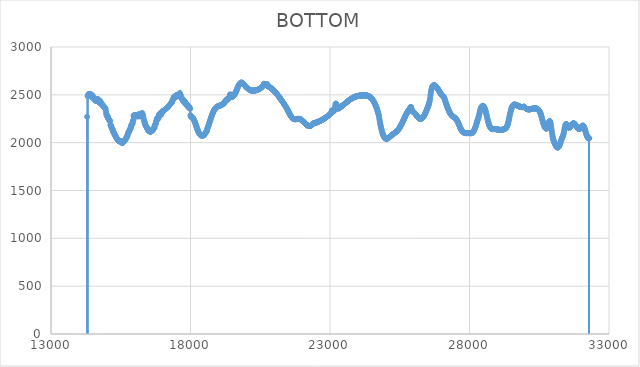
| Category | BOTTOM |
|---|---|
| 14294.5 | 2270.8 |
| 14301.6338 | -9999 |
| 14311.8733 | 2486.17 |
| 14322.1134 | 2484.76 |
| 14332.3535 | 2498.84 |
| 14342.5936 | 2503.06 |
| 14352.8337 | 2508.69 |
| 14363.0738 | 2507.28 |
| 14373.3139 | 2501.65 |
| 14383.554 | 2508.69 |
| 14393.7941 | 2505.87 |
| 14404.0342 | 2507.28 |
| 14414.2743 | 2501.65 |
| 14424.5144 | 2500.24 |
| 14434.7545 | 2493.2 |
| 14444.9946 | 2503.06 |
| 14455.2347 | 2500.24 |
| 14465.4748 | 2496.02 |
| 14475.7149 | 2469.28 |
| 14485.955 | 2481.94 |
| 14496.1951 | 2491.8 |
| 14506.4352 | 2472.09 |
| 14516.6753 | 2477.72 |
| 14526.9154 | 2459.42 |
| 14537.1555 | 2466.46 |
| 14547.3956 | 2463.64 |
| 14557.6357 | 2458.01 |
| 14567.8758 | 2456.61 |
| 14578.1159 | 2441.12 |
| 14588.356 | 2450.98 |
| 14598.5961 | 2438.31 |
| 14608.8362 | 2439.72 |
| 14619.0763 | 2438.31 |
| 14629.3164 | 2442.53 |
| 14639.5565 | 2442.53 |
| 14649.7966 | 2455.2 |
| 14660.0367 | 2435.49 |
| 14670.2768 | 2446.75 |
| 14680.5169 | 2456.61 |
| 14690.757 | 2441.12 |
| 14700.9971 | 2425.64 |
| 14711.2372 | 2425.64 |
| 14721.4772 | 2431.27 |
| 14731.7173 | 2421.42 |
| 14741.9574 | 2412.97 |
| 14752.1975 | 2438.31 |
| 14762.4376 | 2431.27 |
| 14772.6777 | 2428.45 |
| 14782.9178 | 2417.19 |
| 14793.1579 | 2417.19 |
| 14803.398 | 2412.97 |
| 14813.6381 | 2397.49 |
| 14823.8782 | 2397.49 |
| 14834.1183 | 2394.67 |
| 14844.3584 | 2393.26 |
| 14854.5985 | 2391.86 |
| 14864.8386 | 2393.26 |
| 14875.0787 | 2382 |
| 14885.3188 | 2382 |
| 14895.5589 | 2369.33 |
| 14905.799 | 2370.74 |
| 14916.0391 | 2365.11 |
| 14926.2792 | 2363.7 |
| 14936.5193 | 2362.3 |
| 14946.7594 | 2360.89 |
| 14956.9995 | 2351.04 |
| 14967.2396 | 2329.92 |
| 14977.4797 | 2308.81 |
| 14987.7198 | 2291.92 |
| 14997.9599 | 2290.51 |
| 15008.2 | 2273.62 |
| 15018.4401 | 2283.47 |
| 15028.6802 | 2275.02 |
| 15038.9203 | 2267.99 |
| 15049.1604 | 2256.73 |
| 15059.4005 | 2248.28 |
| 15069.6406 | 2242.65 |
| 15079.8807 | 2242.65 |
| 15090.1208 | 2237.02 |
| 15100.3609 | 2228.57 |
| 15110.601 | 2227.17 |
| 15120.8411 | 2225.76 |
| 15131.0812 | 2186.34 |
| 15141.3213 | 2182.12 |
| 15151.5614 | 2182.12 |
| 15161.8015 | 2166.64 |
| 15172.0416 | 2158.19 |
| 15182.2817 | 2151.15 |
| 15192.5218 | 2144.12 |
| 15202.7619 | 2138.49 |
| 15213.0019 | 2137.08 |
| 15223.242 | 2117.37 |
| 15233.4821 | 2115.96 |
| 15243.7222 | 2107.52 |
| 15253.9623 | 2101.89 |
| 15264.2024 | 2096.26 |
| 15274.4425 | 2085 |
| 15284.6826 | 2085 |
| 15294.9227 | 2080.77 |
| 15305.1628 | 2073.74 |
| 15315.4029 | 2065.29 |
| 15325.643 | 2062.47 |
| 15335.8831 | 2055.44 |
| 15346.1232 | 2049.81 |
| 15356.3633 | 2042.77 |
| 15366.6034 | 2038.54 |
| 15376.8435 | 2042.77 |
| 15387.0836 | 2031.51 |
| 15397.3237 | 2028.69 |
| 15407.5638 | 2023.06 |
| 15417.8039 | 2023.06 |
| 15428.044 | 2023.06 |
| 15438.2841 | 2017.43 |
| 15448.5242 | 2013.21 |
| 15458.7643 | 2013.21 |
| 15469.0044 | 2013.21 |
| 15479.2445 | 2014.62 |
| 15489.4846 | 2014.62 |
| 15499.7247 | 2014.62 |
| 15509.9648 | 2016.02 |
| 15520.2049 | 2007.58 |
| 15530.445 | 2007.58 |
| 15540.6851 | 1996.32 |
| 15550.9252 | 1997.72 |
| 15561.1653 | 1997.72 |
| 15571.4054 | 1999.13 |
| 15581.6455 | 2001.95 |
| 15591.8856 | 2003.35 |
| 15602.1257 | 2007.58 |
| 15612.3658 | 2013.21 |
| 15622.6059 | 2013.21 |
| 15632.846 | 2021.65 |
| 15643.0861 | 2020.25 |
| 15653.3262 | 2025.88 |
| 15663.5663 | 2035.73 |
| 15673.8064 | 2035.73 |
| 15684.0465 | 2039.95 |
| 15694.2866 | 2044.18 |
| 15704.5266 | 2056.84 |
| 15714.7667 | 2058.25 |
| 15725.0068 | 2061.07 |
| 15735.2469 | 2076.55 |
| 15745.487 | 2076.55 |
| 15755.7271 | 2093.44 |
| 15765.9672 | 2101.89 |
| 15776.2073 | 2103.3 |
| 15786.4474 | 2110.33 |
| 15796.6875 | 2117.37 |
| 15806.9276 | 2123 |
| 15817.1677 | 2132.86 |
| 15827.4078 | 2132.86 |
| 15837.6479 | 2139.89 |
| 15847.888 | 2149.75 |
| 15858.1281 | 2158.19 |
| 15868.3682 | 2163.82 |
| 15878.6083 | 2183.53 |
| 15888.8484 | 2187.75 |
| 15899.0885 | 2189.16 |
| 15909.3286 | 2190.57 |
| 15919.5687 | 2200.42 |
| 15929.8088 | 2210.27 |
| 15940.0489 | 2231.39 |
| 15950.289 | 2231.39 |
| 15960.5291 | 2284.88 |
| 15970.7692 | 2266.58 |
| 15981.0093 | 2277.84 |
| 15991.2494 | 2290.51 |
| 16001.4895 | 2286.29 |
| 16011.7296 | 2283.47 |
| 16021.9697 | 2283.47 |
| 16032.2098 | 2282.06 |
| 16042.4499 | 2279.25 |
| 16052.69 | 2279.25 |
| 16062.9301 | 2275.02 |
| 16073.1702 | 2275.02 |
| 16083.4103 | 2282.06 |
| 16093.6504 | 2283.47 |
| 16103.8905 | 2276.43 |
| 16114.1306 | 2286.29 |
| 16124.3707 | 2279.25 |
| 16134.6108 | 2297.55 |
| 16144.8509 | 2276.43 |
| 16155.091 | 2276.43 |
| 16165.3311 | 2277.84 |
| 16175.5712 | 2277.84 |
| 16185.8113 | 2276.43 |
| 16196.0514 | 2282.06 |
| 16206.2914 | 2301.77 |
| 16216.5315 | 2301.77 |
| 16226.7716 | 2300.36 |
| 16237.0117 | 2297.55 |
| 16247.2518 | 2283.47 |
| 16257.4919 | 2282.06 |
| 16267.732 | 2311.62 |
| 16277.9721 | 2298.95 |
| 16288.2122 | 2291.92 |
| 16298.4523 | 2282.06 |
| 16308.6924 | 2266.58 |
| 16318.9325 | 2251.09 |
| 16329.1726 | 2229.98 |
| 16339.4127 | 2228.57 |
| 16349.6528 | 2214.5 |
| 16359.8929 | 2211.68 |
| 16370.133 | 2196.2 |
| 16380.3731 | 2184.94 |
| 16390.6132 | 2182.12 |
| 16400.8533 | 2175.08 |
| 16411.0934 | 2168.05 |
| 16421.3335 | 2165.23 |
| 16431.5736 | 2162.42 |
| 16441.8137 | 2151.15 |
| 16452.0538 | 2149.75 |
| 16462.2939 | 2139.89 |
| 16472.534 | 2132.86 |
| 16482.7741 | 2130.04 |
| 16493.0142 | 2125.82 |
| 16503.2543 | 2124.41 |
| 16513.4944 | 2124.41 |
| 16523.7345 | 2118.78 |
| 16533.9746 | 2118.78 |
| 16544.2147 | 2117.37 |
| 16554.4548 | 2114.56 |
| 16564.6949 | 2114.56 |
| 16574.935 | 2114.56 |
| 16585.1751 | 2118.78 |
| 16595.4152 | 2120.19 |
| 16605.6553 | 2132.86 |
| 16615.8954 | 2121.59 |
| 16626.1355 | 2125.82 |
| 16636.3756 | 2128.63 |
| 16646.6157 | 2132.86 |
| 16656.8558 | 2132.86 |
| 16667.0959 | 2142.71 |
| 16677.336 | 2144.12 |
| 16687.5761 | 2152.56 |
| 16697.8162 | 2155.38 |
| 16708.0563 | 2159.6 |
| 16718.2963 | 2180.71 |
| 16728.5364 | 2182.12 |
| 16738.7765 | 2189.16 |
| 16749.0166 | 2199.01 |
| 16759.2567 | 2199.01 |
| 16769.4968 | 2220.13 |
| 16779.7369 | 2227.17 |
| 16789.977 | 2248.28 |
| 16800.2171 | 2255.32 |
| 16810.4572 | 2256.73 |
| 16820.6973 | 2251.09 |
| 16830.9374 | 2259.54 |
| 16841.1775 | 2248.28 |
| 16851.4176 | 2260.95 |
| 16861.6577 | 2282.06 |
| 16871.8978 | 2296.14 |
| 16882.1379 | 2296.14 |
| 16892.378 | 2291.92 |
| 16902.6181 | 2303.18 |
| 16912.8582 | 2296.14 |
| 16923.0983 | 2305.99 |
| 16933.3384 | 2298.95 |
| 16943.5785 | 2289.1 |
| 16953.8186 | 2304.58 |
| 16964.0587 | 2308.81 |
| 16974.2988 | 2321.48 |
| 16984.5389 | 2323.43 |
| 16994.779 | 2325.44 |
| 17005.0191 | 2327.5 |
| 17015.2592 | 2329.63 |
| 17025.4993 | 2331.8 |
| 17035.7394 | 2334.04 |
| 17045.9795 | 2336.33 |
| 17056.2196 | 2338.67 |
| 17066.4597 | 2341.07 |
| 17076.6998 | 2343.53 |
| 17086.9399 | 2346.04 |
| 17097.18 | 2348.61 |
| 17107.4201 | 2351.24 |
| 17117.6602 | 2353.92 |
| 17127.9003 | 2356.65 |
| 17138.1404 | 2359.45 |
| 17148.3805 | 2362.29 |
| 17158.6206 | 2365.2 |
| 17168.8607 | 2368.16 |
| 17179.1008 | 2371.18 |
| 17189.3409 | 2374.25 |
| 17199.581 | 2377.38 |
| 17209.8211 | 2380.56 |
| 17220.0612 | 2383.8 |
| 17230.3013 | 2387.1 |
| 17240.5413 | 2390.45 |
| 17250.7814 | 2393.86 |
| 17261.0215 | 2397.32 |
| 17271.2616 | 2400.84 |
| 17281.5017 | 2404.42 |
| 17291.7418 | 2408.05 |
| 17301.9819 | 2411.74 |
| 17312.222 | 2415.48 |
| 17322.4621 | 2419.28 |
| 17332.7022 | 2423.14 |
| 17342.9423 | 2427.05 |
| 17353.1824 | 2439.72 |
| 17363.4225 | 2452.38 |
| 17373.6626 | 2448.16 |
| 17383.9027 | 2455.2 |
| 17394.1428 | 2466.46 |
| 17404.3829 | 2479.13 |
| 17414.623 | 2469.28 |
| 17424.8631 | 2469.28 |
| 17435.1032 | 2483.35 |
| 17445.3433 | 2484.76 |
| 17455.5834 | 2486.17 |
| 17465.8235 | 2481.94 |
| 17476.0636 | 2491.8 |
| 17486.3037 | 2477.72 |
| 17496.5438 | 2483.35 |
| 17506.7839 | 2498.84 |
| 17517.024 | 2498.84 |
| 17527.2641 | 2497.43 |
| 17537.5042 | 2494.61 |
| 17547.7443 | 2496.02 |
| 17557.9844 | 2496.02 |
| 17568.2245 | 2496.02 |
| 17578.4646 | 2496.02 |
| 17588.7047 | 2498.84 |
| 17598.9448 | 2498.84 |
| 17609.1849 | 2501.65 |
| 17619.425 | 2519.95 |
| 17629.6651 | 2498.84 |
| 17639.9052 | 2497.43 |
| 17650.1453 | 2497.43 |
| 17660.3854 | 2469.28 |
| 17670.6255 | 2469.28 |
| 17680.8656 | 2459.42 |
| 17691.1057 | 2463.64 |
| 17701.3458 | 2450.98 |
| 17711.5859 | 2459.42 |
| 17721.826 | 2453.79 |
| 17732.0661 | 2436.9 |
| 17742.3062 | 2432.68 |
| 17752.5463 | 2432.68 |
| 17762.7864 | 2427.05 |
| 17773.0264 | 2427.05 |
| 17783.2665 | 2424.23 |
| 17793.5066 | 2414.38 |
| 17803.7467 | 2429.86 |
| 17813.9868 | 2420.01 |
| 17824.2269 | 2404.53 |
| 17834.467 | 2401.71 |
| 17844.7071 | 2401.71 |
| 17854.9472 | 2403.12 |
| 17865.1873 | 2403.12 |
| 17875.4274 | 2390.45 |
| 17885.6675 | 2398.89 |
| 17895.9076 | 2380.6 |
| 17906.1477 | 2387.63 |
| 17916.3878 | 2383.41 |
| 17926.6279 | 2367.93 |
| 17936.868 | 2376.37 |
| 17947.1081 | 2374.97 |
| 17957.3482 | 2370.74 |
| 17967.5883 | 2362.3 |
| 17977.8284 | 2362.3 |
| 17988.0685 | 2352.44 |
| 17998.3086 | 2287.69 |
| 18008.5487 | 2277.84 |
| 18018.7888 | 2273.62 |
| 18029.0289 | 2265.17 |
| 18039.269 | 2265.17 |
| 18049.5091 | 2265.17 |
| 18059.7492 | 2264.41 |
| 18069.9893 | 2262.6 |
| 18080.2294 | 2259.83 |
| 18090.4695 | 2256.17 |
| 18100.7096 | 2251.68 |
| 18110.9497 | 2246.45 |
| 18121.1898 | 2240.53 |
| 18131.4299 | 2234 |
| 18141.67 | 2226.94 |
| 18151.9101 | 2219.41 |
| 18162.1502 | 2211.48 |
| 18172.3903 | 2203.24 |
| 18182.6304 | 2194.74 |
| 18192.8705 | 2186.06 |
| 18203.1106 | 2177.28 |
| 18213.3507 | 2168.46 |
| 18223.5908 | 2159.67 |
| 18233.8309 | 2150.99 |
| 18244.071 | 2142.49 |
| 18254.3111 | 2134.24 |
| 18264.5512 | 2126.31 |
| 18274.7913 | 2118.78 |
| 18285.0314 | 2111.71 |
| 18295.2715 | 2105.17 |
| 18305.5116 | 2099.24 |
| 18315.7517 | 2094 |
| 18325.9917 | 2089.5 |
| 18336.2318 | 2085.82 |
| 18346.4719 | 2083.04 |
| 18356.712 | 2081.22 |
| 18366.9521 | 2080.44 |
| 18377.1922 | 2080.77 |
| 18387.4323 | 2079.37 |
| 18397.6724 | 2069.51 |
| 18407.9125 | 2077.96 |
| 18418.1526 | 2076.55 |
| 18428.3927 | 2075.14 |
| 18438.6328 | 2075.14 |
| 18448.8729 | 2076.55 |
| 18459.113 | 2076.55 |
| 18469.3531 | 2076.55 |
| 18479.5932 | 2077.96 |
| 18489.8333 | 2082.18 |
| 18500.0734 | 2086.4 |
| 18510.3135 | 2092.03 |
| 18520.5536 | 2092.03 |
| 18530.7937 | 2099.07 |
| 18541.0338 | 2104.7 |
| 18551.2739 | 2107.52 |
| 18561.514 | 2113.15 |
| 18571.7541 | 2118.78 |
| 18581.9942 | 2118.78 |
| 18592.2343 | 2138.49 |
| 18602.4744 | 2145.77 |
| 18612.7145 | 2153.38 |
| 18622.9546 | 2161.3 |
| 18633.1947 | 2169.48 |
| 18643.4348 | 2177.9 |
| 18653.6749 | 2186.52 |
| 18663.915 | 2195.31 |
| 18674.1551 | 2204.23 |
| 18684.3952 | 2213.25 |
| 18694.6353 | 2222.34 |
| 18704.8754 | 2231.47 |
| 18715.1155 | 2240.59 |
| 18725.3556 | 2249.69 |
| 18735.5957 | 2258.71 |
| 18745.8358 | 2267.63 |
| 18756.0759 | 2276.38 |
| 18766.316 | 2284.92 |
| 18776.5561 | 2293.21 |
| 18786.7962 | 2301.2 |
| 18797.0363 | 2308.84 |
| 18807.2764 | 2316.08 |
| 18817.5165 | 2322.88 |
| 18827.7566 | 2329.2 |
| 18837.9967 | 2335.05 |
| 18848.2368 | 2340.45 |
| 18858.4769 | 2345.43 |
| 18868.717 | 2350 |
| 18878.957 | 2354.19 |
| 18889.1971 | 2358.02 |
| 18899.4372 | 2361.51 |
| 18909.6773 | 2364.68 |
| 18919.9174 | 2367.55 |
| 18930.1575 | 2370.15 |
| 18940.3976 | 2372.5 |
| 18950.6377 | 2374.62 |
| 18960.8778 | 2376.53 |
| 18971.1179 | 2378.25 |
| 18981.358 | 2379.81 |
| 18991.5981 | 2381.22 |
| 19001.8382 | 2382.52 |
| 19012.0783 | 2383.71 |
| 19022.3184 | 2384.82 |
| 19032.5585 | 2385.87 |
| 19042.7986 | 2386.89 |
| 19053.0387 | 2387.9 |
| 19063.2788 | 2388.91 |
| 19073.5189 | 2389.96 |
| 19083.759 | 2391.06 |
| 19093.9991 | 2392.22 |
| 19104.2392 | 2393.49 |
| 19114.4793 | 2394.87 |
| 19124.7194 | 2396.39 |
| 19134.9595 | 2398.07 |
| 19145.1996 | 2399.93 |
| 19155.4397 | 2402 |
| 19165.6798 | 2404.29 |
| 19175.9199 | 2406.83 |
| 19186.16 | 2409.63 |
| 19196.4001 | 2412.73 |
| 19206.6402 | 2416.14 |
| 19216.8803 | 2419.88 |
| 19227.1204 | 2423.98 |
| 19237.3605 | 2428.45 |
| 19247.6006 | 2438.31 |
| 19257.8407 | 2434.08 |
| 19268.0808 | 2443.94 |
| 19278.3209 | 2441.12 |
| 19288.561 | 2441.12 |
| 19298.8011 | 2448.16 |
| 19309.0412 | 2456.61 |
| 19319.2813 | 2449.57 |
| 19329.5214 | 2452.38 |
| 19339.7615 | 2458.01 |
| 19350.0016 | 2459.42 |
| 19360.2417 | 2462.24 |
| 19370.4818 | 2467.87 |
| 19380.7219 | 2467.87 |
| 19390.962 | 2467.87 |
| 19401.2021 | 2483.35 |
| 19411.4422 | 2504.47 |
| 19421.6823 | 2490.39 |
| 19431.9224 | 2490.39 |
| 19442.1625 | 2493.2 |
| 19452.4025 | 2494.61 |
| 19462.6426 | 2493.2 |
| 19472.8827 | 2503.06 |
| 19483.1228 | 2483.35 |
| 19493.3629 | 2481.91 |
| 19503.603 | 2481.46 |
| 19513.8431 | 2481.94 |
| 19524.0832 | 2483.3 |
| 19534.3233 | 2485.46 |
| 19544.5634 | 2488.37 |
| 19554.8035 | 2491.97 |
| 19565.0436 | 2496.19 |
| 19575.2837 | 2500.98 |
| 19585.5238 | 2506.27 |
| 19595.7639 | 2512.01 |
| 19606.004 | 2518.13 |
| 19616.2441 | 2524.57 |
| 19626.4842 | 2531.27 |
| 19636.7243 | 2538.17 |
| 19646.9644 | 2545.21 |
| 19657.2045 | 2552.32 |
| 19667.4446 | 2559.46 |
| 19677.6847 | 2566.54 |
| 19687.9248 | 2573.53 |
| 19698.1649 | 2580.34 |
| 19708.405 | 2586.93 |
| 19718.6451 | 2593.23 |
| 19728.8852 | 2599.18 |
| 19739.1253 | 2604.72 |
| 19749.3654 | 2609.78 |
| 19759.6055 | 2614.32 |
| 19769.8456 | 2618.26 |
| 19780.0857 | 2621.54 |
| 19790.3258 | 2624.11 |
| 19800.5659 | 2625.93 |
| 19810.806 | 2627.01 |
| 19821.0461 | 2627.43 |
| 19831.2862 | 2627.23 |
| 19841.5263 | 2626.47 |
| 19851.7664 | 2625.19 |
| 19862.0065 | 2623.46 |
| 19872.2466 | 2621.32 |
| 19882.4867 | 2618.83 |
| 19892.7268 | 2616.03 |
| 19902.9669 | 2613 |
| 19913.207 | 2609.76 |
| 19923.4471 | 2606.39 |
| 19933.6872 | 2602.93 |
| 19943.9273 | 2599.44 |
| 19954.1674 | 2595.96 |
| 19964.4075 | 2592.55 |
| 19974.6476 | 2589.21 |
| 19984.8877 | 2585.96 |
| 19995.1278 | 2582.79 |
| 20005.3679 | 2579.7 |
| 20015.608 | 2576.72 |
| 20025.8481 | 2573.83 |
| 20036.0882 | 2571.04 |
| 20046.3282 | 2568.36 |
| 20056.5683 | 2565.79 |
| 20066.8084 | 2563.34 |
| 20077.0485 | 2561.01 |
| 20087.2886 | 2558.8 |
| 20097.5287 | 2556.72 |
| 20107.7688 | 2554.78 |
| 20118.0089 | 2552.97 |
| 20128.249 | 2551.31 |
| 20138.4891 | 2549.79 |
| 20148.7292 | 2548.43 |
| 20158.9693 | 2547.22 |
| 20169.2094 | 2546.17 |
| 20179.4495 | 2545.29 |
| 20189.6896 | 2544.57 |
| 20199.9297 | 2544.01 |
| 20210.1698 | 2543.61 |
| 20220.4099 | 2543.34 |
| 20230.65 | 2543.22 |
| 20240.8901 | 2543.21 |
| 20251.1302 | 2543.32 |
| 20261.3703 | 2543.54 |
| 20271.6104 | 2543.86 |
| 20281.8505 | 2544.27 |
| 20292.0906 | 2544.76 |
| 20302.3307 | 2545.32 |
| 20312.5708 | 2545.94 |
| 20322.8109 | 2546.62 |
| 20333.051 | 2547.34 |
| 20343.2911 | 2548.1 |
| 20353.5312 | 2548.89 |
| 20363.7713 | 2549.72 |
| 20374.0114 | 2550.58 |
| 20384.2515 | 2551.5 |
| 20394.4916 | 2552.47 |
| 20404.7317 | 2553.51 |
| 20414.9718 | 2554.62 |
| 20425.2119 | 2555.81 |
| 20435.452 | 2557.08 |
| 20445.6921 | 2558.45 |
| 20455.9322 | 2559.92 |
| 20466.1723 | 2561.49 |
| 20476.4124 | 2563.18 |
| 20486.6525 | 2564.99 |
| 20496.8926 | 2566.94 |
| 20507.1327 | 2569.01 |
| 20517.3728 | 2571.24 |
| 20527.6129 | 2573.61 |
| 20537.853 | 2576.15 |
| 20548.0931 | 2578.84 |
| 20558.3332 | 2581.72 |
| 20568.5733 | 2584.77 |
| 20578.8134 | 2588.01 |
| 20589.0535 | 2591.45 |
| 20599.2936 | 2595.09 |
| 20609.5337 | 2598.93 |
| 20619.7738 | 2603 |
| 20630.0139 | 2615.67 |
| 20640.2539 | 2615.67 |
| 20650.494 | 2612.85 |
| 20660.7341 | 2612.85 |
| 20670.9742 | 2610.04 |
| 20681.2143 | 2608.63 |
| 20691.4544 | 2608.63 |
| 20701.6945 | 2608.63 |
| 20711.9346 | 2608.63 |
| 20722.1747 | 2608.63 |
| 20732.4148 | 2610.04 |
| 20742.6549 | 2610.04 |
| 20752.895 | 2611.44 |
| 20763.1351 | 2590.33 |
| 20773.3752 | 2591.74 |
| 20783.6153 | 2590.33 |
| 20793.8554 | 2587.52 |
| 20804.0955 | 2585.94 |
| 20814.3356 | 2584.28 |
| 20824.5757 | 2582.53 |
| 20834.8158 | 2580.68 |
| 20845.0559 | 2578.76 |
| 20855.296 | 2576.74 |
| 20865.5361 | 2574.64 |
| 20875.7762 | 2572.46 |
| 20886.0163 | 2570.2 |
| 20896.2564 | 2567.85 |
| 20906.4965 | 2565.43 |
| 20916.7366 | 2562.93 |
| 20926.9767 | 2560.36 |
| 20937.2168 | 2557.71 |
| 20947.4569 | 2554.99 |
| 20957.697 | 2552.19 |
| 20967.9371 | 2549.33 |
| 20978.1772 | 2546.39 |
| 20988.4173 | 2543.39 |
| 20998.6574 | 2540.33 |
| 21008.8975 | 2537.2 |
| 21019.1376 | 2534 |
| 21029.3777 | 2530.75 |
| 21039.6178 | 2527.43 |
| 21049.8579 | 2524.06 |
| 21060.098 | 2520.62 |
| 21070.3381 | 2517.13 |
| 21080.5782 | 2513.59 |
| 21090.8183 | 2509.99 |
| 21101.0584 | 2506.35 |
| 21111.2985 | 2502.65 |
| 21121.5386 | 2498.9 |
| 21131.7787 | 2495.1 |
| 21142.0188 | 2491.26 |
| 21152.2589 | 2487.37 |
| 21162.499 | 2483.44 |
| 21172.7391 | 2479.47 |
| 21182.9792 | 2475.46 |
| 21193.2193 | 2471.4 |
| 21203.4594 | 2467.31 |
| 21213.6995 | 2463.18 |
| 21223.9396 | 2459.02 |
| 21234.1797 | 2454.83 |
| 21244.4198 | 2450.6 |
| 21254.6599 | 2446.34 |
| 21264.8999 | 2442.05 |
| 21275.14 | 2437.74 |
| 21285.3801 | 2433.39 |
| 21295.6202 | 2429.03 |
| 21305.8603 | 2424.63 |
| 21316.1004 | 2420.22 |
| 21326.3405 | 2415.79 |
| 21336.5806 | 2411.33 |
| 21346.8207 | 2406.85 |
| 21357.0608 | 2402.33 |
| 21367.3009 | 2397.77 |
| 21377.541 | 2393.16 |
| 21387.7811 | 2388.49 |
| 21398.0212 | 2383.76 |
| 21408.2613 | 2378.95 |
| 21418.5014 | 2374.06 |
| 21428.7415 | 2369.09 |
| 21438.9816 | 2364.02 |
| 21449.2217 | 2358.84 |
| 21459.4618 | 2353.56 |
| 21469.7019 | 2348.15 |
| 21479.942 | 2342.62 |
| 21490.1821 | 2336.96 |
| 21500.4222 | 2331.16 |
| 21510.6623 | 2325.27 |
| 21520.9024 | 2319.31 |
| 21531.1425 | 2313.35 |
| 21541.3826 | 2307.41 |
| 21551.6227 | 2301.55 |
| 21561.8628 | 2295.8 |
| 21572.1029 | 2290.21 |
| 21582.343 | 2284.82 |
| 21592.5831 | 2279.67 |
| 21602.8232 | 2274.8 |
| 21613.0633 | 2270.27 |
| 21623.3034 | 2266.11 |
| 21633.5435 | 2262.36 |
| 21643.7836 | 2259.05 |
| 21654.0237 | 2256.18 |
| 21664.2638 | 2253.71 |
| 21674.5039 | 2251.62 |
| 21684.744 | 2249.88 |
| 21694.9841 | 2248.46 |
| 21705.2242 | 2247.35 |
| 21715.4643 | 2246.51 |
| 21725.7044 | 2245.91 |
| 21735.9445 | 2245.54 |
| 21746.1846 | 2245.37 |
| 21756.4247 | 2245.36 |
| 21766.6648 | 2245.49 |
| 21776.9049 | 2245.74 |
| 21787.145 | 2246.09 |
| 21797.3851 | 2246.49 |
| 21807.6252 | 2246.94 |
| 21817.8653 | 2247.39 |
| 21828.1054 | 2247.84 |
| 21838.3455 | 2248.24 |
| 21848.5856 | 2248.57 |
| 21858.8257 | 2248.82 |
| 21869.0658 | 2248.94 |
| 21879.3059 | 2248.92 |
| 21889.546 | 2248.73 |
| 21899.786 | 2248.34 |
| 21910.0261 | 2247.73 |
| 21920.2662 | 2246.87 |
| 21930.5063 | 2245.74 |
| 21940.7464 | 2244.36 |
| 21950.9865 | 2242.73 |
| 21961.2266 | 2240.89 |
| 21971.4667 | 2238.84 |
| 21981.7068 | 2236.6 |
| 21991.9469 | 2234.2 |
| 22002.187 | 2231.65 |
| 22012.4271 | 2228.97 |
| 22022.6672 | 2226.18 |
| 22032.9073 | 2223.3 |
| 22043.1474 | 2220.34 |
| 22053.3875 | 2217.32 |
| 22063.6276 | 2214.26 |
| 22073.8677 | 2211.18 |
| 22084.1078 | 2208.1 |
| 22094.3479 | 2205.03 |
| 22104.588 | 2202 |
| 22114.8281 | 2199.01 |
| 22125.0682 | 2196.1 |
| 22135.3083 | 2193.27 |
| 22145.5484 | 2190.56 |
| 22155.7885 | 2187.96 |
| 22166.0286 | 2185.51 |
| 22176.2687 | 2183.21 |
| 22186.5088 | 2181.1 |
| 22196.7489 | 2179.18 |
| 22206.989 | 2177.48 |
| 22217.2291 | 2176.01 |
| 22227.4692 | 2174.79 |
| 22237.7093 | 2173.84 |
| 22247.9494 | 2173.18 |
| 22258.1895 | 2172.83 |
| 22268.4296 | 2172.79 |
| 22278.6697 | 2173.1 |
| 22288.9098 | 2173.77 |
| 22299.1499 | 2174.82 |
| 22309.39 | 2176.27 |
| 22319.6301 | 2178.13 |
| 22329.8702 | 2180.42 |
| 22340.1103 | 2183.16 |
| 22350.3504 | 2186.38 |
| 22360.5905 | 2190.08 |
| 22370.8306 | 2194.28 |
| 22381.0707 | 2199.01 |
| 22391.3108 | 2199.75 |
| 22401.5509 | 2200.51 |
| 22411.791 | 2201.31 |
| 22422.0311 | 2202.13 |
| 22432.2712 | 2202.98 |
| 22442.5113 | 2203.86 |
| 22452.7514 | 2204.78 |
| 22462.9915 | 2205.72 |
| 22473.2316 | 2206.69 |
| 22483.4717 | 2207.69 |
| 22493.7118 | 2208.73 |
| 22503.9519 | 2209.79 |
| 22514.192 | 2210.88 |
| 22524.4321 | 2212 |
| 22534.6722 | 2213.15 |
| 22544.9122 | 2214.33 |
| 22555.1523 | 2215.54 |
| 22565.3924 | 2216.78 |
| 22575.6325 | 2218.05 |
| 22585.8726 | 2219.35 |
| 22596.1127 | 2220.68 |
| 22606.3528 | 2222.04 |
| 22616.5929 | 2223.43 |
| 22626.833 | 2224.85 |
| 22637.0731 | 2226.3 |
| 22647.3132 | 2227.77 |
| 22657.5533 | 2229.28 |
| 22667.7934 | 2230.82 |
| 22678.0335 | 2232.39 |
| 22688.2736 | 2233.98 |
| 22698.5137 | 2235.61 |
| 22708.7538 | 2237.27 |
| 22718.9939 | 2238.95 |
| 22729.234 | 2240.67 |
| 22739.4741 | 2242.42 |
| 22749.7142 | 2244.19 |
| 22759.9543 | 2246 |
| 22770.1944 | 2247.83 |
| 22780.4345 | 2249.7 |
| 22790.6746 | 2251.59 |
| 22800.9147 | 2253.52 |
| 22811.1548 | 2255.47 |
| 22821.3949 | 2257.45 |
| 22831.635 | 2259.47 |
| 22841.8751 | 2261.51 |
| 22852.1152 | 2263.59 |
| 22862.3553 | 2265.69 |
| 22872.5954 | 2267.82 |
| 22882.8355 | 2269.98 |
| 22893.0756 | 2272.18 |
| 22903.3157 | 2274.4 |
| 22913.5558 | 2276.65 |
| 22923.7959 | 2278.93 |
| 22934.036 | 2281.24 |
| 22944.2761 | 2283.58 |
| 22954.5162 | 2285.95 |
| 22964.7563 | 2288.35 |
| 22974.9964 | 2290.79 |
| 22985.2365 | 2293.25 |
| 22995.4766 | 2295.74 |
| 23005.7167 | 2298.25 |
| 23015.9568 | 2300.8 |
| 23026.1969 | 2303.38 |
| 23036.437 | 2305.99 |
| 23046.6771 | 2318.66 |
| 23056.9172 | 2320.07 |
| 23067.1573 | 2338.37 |
| 23077.3974 | 2335.55 |
| 23087.6375 | 2329.92 |
| 23097.8776 | 2329.92 |
| 23108.1177 | 2322.88 |
| 23118.3578 | 2331.33 |
| 23128.5979 | 2331.33 |
| 23138.838 | 2331.33 |
| 23149.0781 | 2335.55 |
| 23159.3182 | 2336.96 |
| 23169.5583 | 2348.22 |
| 23179.7984 | 2369.33 |
| 23190.0385 | 2389.04 |
| 23200.2786 | 2407.34 |
| 23210.5187 | 2405.93 |
| 23220.7587 | 2407.34 |
| 23230.9988 | 2403.12 |
| 23241.2389 | 2382 |
| 23251.479 | 2360.89 |
| 23261.7191 | 2377.78 |
| 23271.9592 | 2363.7 |
| 23282.1993 | 2365.11 |
| 23292.4394 | 2355.26 |
| 23302.6795 | 2357.03 |
| 23312.9196 | 2358.86 |
| 23323.1597 | 2360.75 |
| 23333.3998 | 2362.69 |
| 23343.6399 | 2364.68 |
| 23353.88 | 2366.73 |
| 23364.1201 | 2368.82 |
| 23374.3602 | 2370.95 |
| 23384.6003 | 2373.13 |
| 23394.8404 | 2375.34 |
| 23405.0805 | 2377.6 |
| 23415.3206 | 2379.89 |
| 23425.5607 | 2382.2 |
| 23435.8008 | 2384.55 |
| 23446.0409 | 2386.93 |
| 23456.281 | 2389.33 |
| 23466.5211 | 2391.75 |
| 23476.7612 | 2394.18 |
| 23487.0013 | 2396.64 |
| 23497.2414 | 2399.11 |
| 23507.4815 | 2401.59 |
| 23517.7216 | 2404.07 |
| 23527.9617 | 2406.57 |
| 23538.2018 | 2409.07 |
| 23548.4419 | 2411.56 |
| 23558.682 | 2414.06 |
| 23568.9221 | 2416.55 |
| 23579.1622 | 2419.04 |
| 23589.4023 | 2421.51 |
| 23599.6424 | 2423.97 |
| 23609.8825 | 2426.42 |
| 23620.1226 | 2428.85 |
| 23630.3627 | 2431.26 |
| 23640.6028 | 2433.65 |
| 23650.8429 | 2436.02 |
| 23661.083 | 2438.35 |
| 23671.3231 | 2440.66 |
| 23681.5632 | 2442.93 |
| 23691.8033 | 2445.17 |
| 23702.0434 | 2447.37 |
| 23712.2835 | 2449.53 |
| 23722.5236 | 2451.65 |
| 23732.7637 | 2453.72 |
| 23743.0038 | 2455.75 |
| 23753.2439 | 2457.72 |
| 23763.484 | 2459.64 |
| 23773.7241 | 2461.5 |
| 23783.9642 | 2463.31 |
| 23794.2043 | 2465.05 |
| 23804.4444 | 2466.73 |
| 23814.6845 | 2468.35 |
| 23824.9246 | 2469.91 |
| 23835.1647 | 2471.41 |
| 23845.4048 | 2472.85 |
| 23855.6449 | 2474.23 |
| 23865.885 | 2475.55 |
| 23876.1251 | 2476.82 |
| 23886.3652 | 2478.03 |
| 23896.6053 | 2479.19 |
| 23906.8454 | 2480.3 |
| 23917.0855 | 2481.36 |
| 23927.3255 | 2482.36 |
| 23937.5656 | 2483.32 |
| 23947.8057 | 2484.23 |
| 23958.0458 | 2485.09 |
| 23968.2859 | 2485.91 |
| 23978.526 | 2486.68 |
| 23988.7661 | 2487.41 |
| 23999.0062 | 2488.09 |
| 24009.2463 | 2488.74 |
| 24019.4864 | 2489.34 |
| 24029.7265 | 2489.91 |
| 24039.9666 | 2490.43 |
| 24050.2067 | 2490.92 |
| 24060.4468 | 2491.38 |
| 24070.6869 | 2491.8 |
| 24080.927 | 2492.19 |
| 24091.1671 | 2492.54 |
| 24101.4072 | 2492.86 |
| 24111.6473 | 2493.15 |
| 24121.8874 | 2493.42 |
| 24132.1275 | 2493.65 |
| 24142.3676 | 2493.86 |
| 24152.6077 | 2494.05 |
| 24162.8478 | 2494.2 |
| 24173.0879 | 2494.34 |
| 24183.328 | 2494.45 |
| 24193.5681 | 2494.54 |
| 24203.8082 | 2494.61 |
| 24214.0483 | 2494.66 |
| 24224.2884 | 2494.69 |
| 24234.5285 | 2494.68 |
| 24244.7686 | 2494.63 |
| 24255.0087 | 2494.53 |
| 24265.2488 | 2494.37 |
| 24275.4889 | 2494.15 |
| 24285.729 | 2493.87 |
| 24295.9691 | 2493.5 |
| 24306.2092 | 2493.05 |
| 24316.4493 | 2492.5 |
| 24326.6894 | 2491.86 |
| 24336.9295 | 2491.11 |
| 24347.1696 | 2490.25 |
| 24357.4097 | 2489.26 |
| 24367.6498 | 2488.14 |
| 24377.8899 | 2486.89 |
| 24388.13 | 2485.5 |
| 24398.3701 | 2483.95 |
| 24408.6102 | 2482.24 |
| 24418.8503 | 2480.37 |
| 24429.0904 | 2478.33 |
| 24439.3305 | 2476.1 |
| 24449.5706 | 2473.69 |
| 24459.8107 | 2471.08 |
| 24470.0508 | 2468.27 |
| 24480.2909 | 2465.25 |
| 24490.531 | 2462.02 |
| 24500.7711 | 2458.56 |
| 24511.0112 | 2454.86 |
| 24521.2513 | 2450.93 |
| 24531.4914 | 2446.75 |
| 24541.7315 | 2442.32 |
| 24551.9716 | 2437.63 |
| 24562.2117 | 2432.67 |
| 24572.4518 | 2427.43 |
| 24582.6919 | 2421.91 |
| 24592.932 | 2416.1 |
| 24603.1721 | 2409.99 |
| 24613.4122 | 2403.58 |
| 24623.6523 | 2396.85 |
| 24633.8924 | 2389.8 |
| 24644.1325 | 2382.43 |
| 24654.3725 | 2374.72 |
| 24664.6126 | 2366.68 |
| 24674.8527 | 2358.28 |
| 24685.0928 | 2349.52 |
| 24695.3329 | 2340.4 |
| 24705.573 | 2330.92 |
| 24715.8131 | 2321.05 |
| 24726.0532 | 2310.79 |
| 24736.2933 | 2300.15 |
| 24746.5334 | 2289.1 |
| 24756.7735 | 2269.93 |
| 24767.0136 | 2251.61 |
| 24777.2537 | 2234.11 |
| 24787.4938 | 2217.43 |
| 24797.7339 | 2201.57 |
| 24807.974 | 2186.51 |
| 24818.2141 | 2172.25 |
| 24828.4542 | 2158.78 |
| 24838.6943 | 2146.08 |
| 24848.9344 | 2134.16 |
| 24859.1745 | 2123 |
| 24869.4146 | 2112.6 |
| 24879.6547 | 2102.94 |
| 24889.8948 | 2094.02 |
| 24900.1349 | 2085.83 |
| 24910.375 | 2078.36 |
| 24920.6151 | 2071.61 |
| 24930.8552 | 2065.56 |
| 24941.0953 | 2060.2 |
| 24951.3354 | 2055.54 |
| 24961.5755 | 2051.55 |
| 24971.8156 | 2048.24 |
| 24982.0557 | 2045.58 |
| 24992.2958 | 2043.58 |
| 25002.5359 | 2042.19 |
| 25012.776 | 2041.36 |
| 25023.0161 | 2041.05 |
| 25033.2562 | 2041.23 |
| 25043.4963 | 2041.84 |
| 25053.7364 | 2042.84 |
| 25063.9765 | 2044.19 |
| 25074.2166 | 2045.84 |
| 25084.4567 | 2047.75 |
| 25094.6968 | 2049.88 |
| 25104.9369 | 2052.17 |
| 25115.177 | 2054.6 |
| 25125.4171 | 2057.11 |
| 25135.6572 | 2059.66 |
| 25145.8973 | 2062.21 |
| 25156.1374 | 2064.76 |
| 25166.3775 | 2067.29 |
| 25176.6176 | 2069.81 |
| 25186.8577 | 2072.31 |
| 25197.0978 | 2074.79 |
| 25207.3379 | 2077.25 |
| 25217.578 | 2079.67 |
| 25227.8181 | 2082.07 |
| 25238.0582 | 2084.43 |
| 25248.2983 | 2086.75 |
| 25258.5384 | 2089.03 |
| 25268.7785 | 2091.26 |
| 25279.0186 | 2093.44 |
| 25289.2587 | 2095.58 |
| 25299.4988 | 2097.68 |
| 25309.7389 | 2099.76 |
| 25319.979 | 2101.85 |
| 25330.2191 | 2103.97 |
| 25340.4592 | 2106.13 |
| 25350.6993 | 2108.35 |
| 25360.9394 | 2110.65 |
| 25371.1795 | 2113.05 |
| 25381.4196 | 2115.57 |
| 25391.6597 | 2118.23 |
| 25401.8997 | 2121.04 |
| 25412.1398 | 2124.03 |
| 25422.3799 | 2127.22 |
| 25432.62 | 2130.63 |
| 25442.8601 | 2134.26 |
| 25453.1002 | 2138.15 |
| 25463.3403 | 2142.28 |
| 25473.5804 | 2146.63 |
| 25483.8205 | 2151.21 |
| 25494.0606 | 2156 |
| 25504.3007 | 2160.98 |
| 25514.5408 | 2166.15 |
| 25524.7809 | 2171.49 |
| 25535.021 | 2176.99 |
| 25545.2611 | 2182.65 |
| 25555.5012 | 2188.45 |
| 25565.7413 | 2194.38 |
| 25575.9814 | 2200.42 |
| 25586.2215 | 2206.57 |
| 25596.4616 | 2212.81 |
| 25606.7017 | 2219.13 |
| 25616.9418 | 2225.51 |
| 25627.1819 | 2231.93 |
| 25637.422 | 2238.38 |
| 25647.6621 | 2244.84 |
| 25657.9022 | 2251.3 |
| 25668.1423 | 2257.74 |
| 25678.3824 | 2264.14 |
| 25688.6225 | 2270.5 |
| 25698.8626 | 2276.79 |
| 25709.1027 | 2282.99 |
| 25719.3428 | 2289.1 |
| 25729.5829 | 2295.09 |
| 25739.823 | 2300.96 |
| 25750.0631 | 2306.68 |
| 25760.3032 | 2312.24 |
| 25770.5433 | 2317.62 |
| 25780.7834 | 2322.81 |
| 25791.0235 | 2327.8 |
| 25801.2636 | 2332.55 |
| 25811.5037 | 2337.07 |
| 25821.7438 | 2341.34 |
| 25831.9839 | 2345.33 |
| 25842.224 | 2349.04 |
| 25852.4641 | 2352.44 |
| 25862.7042 | 2359.48 |
| 25872.9443 | 2360.89 |
| 25883.1844 | 2370.74 |
| 25893.4245 | 2373.56 |
| 25903.6646 | 2373.56 |
| 25913.9047 | 2336.96 |
| 25924.1448 | 2346.81 |
| 25934.3849 | 2345.41 |
| 25944.625 | 2334.14 |
| 25954.8651 | 2325.7 |
| 25965.1052 | 2324.8 |
| 25975.3453 | 2323.43 |
| 25985.5854 | 2321.64 |
| 25995.8255 | 2319.46 |
| 26006.0656 | 2316.93 |
| 26016.3057 | 2314.09 |
| 26026.5458 | 2310.97 |
| 26036.7859 | 2307.62 |
| 26047.026 | 2304.06 |
| 26057.2661 | 2300.35 |
| 26067.5062 | 2296.51 |
| 26077.7463 | 2292.59 |
| 26087.9864 | 2288.62 |
| 26098.2265 | 2284.64 |
| 26108.4666 | 2280.69 |
| 26118.7067 | 2276.81 |
| 26128.9468 | 2273.03 |
| 26139.1869 | 2269.39 |
| 26149.427 | 2265.94 |
| 26159.6671 | 2262.7 |
| 26169.9072 | 2259.71 |
| 26180.1473 | 2257.02 |
| 26190.3873 | 2254.67 |
| 26200.6274 | 2252.68 |
| 26210.8675 | 2251.09 |
| 26221.1076 | 2249.95 |
| 26231.3477 | 2249.25 |
| 26241.5878 | 2248.99 |
| 26251.8279 | 2249.15 |
| 26262.068 | 2249.75 |
| 26272.3081 | 2250.78 |
| 26282.5482 | 2252.23 |
| 26292.7883 | 2254.09 |
| 26303.0284 | 2256.38 |
| 26313.2685 | 2259.07 |
| 26323.5086 | 2262.17 |
| 26333.7487 | 2265.67 |
| 26343.9888 | 2269.57 |
| 26354.2289 | 2273.87 |
| 26364.469 | 2278.56 |
| 26374.7091 | 2283.64 |
| 26384.9492 | 2289.1 |
| 26395.1893 | 2294.94 |
| 26405.4294 | 2301.11 |
| 26415.6695 | 2307.59 |
| 26425.9096 | 2314.32 |
| 26436.1497 | 2321.26 |
| 26446.3898 | 2328.38 |
| 26456.6299 | 2335.63 |
| 26466.87 | 2342.97 |
| 26477.1101 | 2350.35 |
| 26487.3502 | 2357.75 |
| 26497.5903 | 2365.11 |
| 26507.8304 | 2372.46 |
| 26518.0705 | 2380.04 |
| 26528.3106 | 2388.19 |
| 26538.5507 | 2397.2 |
| 26548.7908 | 2407.41 |
| 26559.0309 | 2419.12 |
| 26569.271 | 2432.66 |
| 26579.5111 | 2448.33 |
| 26589.7512 | 2466.46 |
| 26599.9913 | 2491.92 |
| 26610.2314 | 2513.89 |
| 26620.4715 | 2532.62 |
| 26630.7116 | 2548.38 |
| 26640.9517 | 2561.43 |
| 26651.1918 | 2572.02 |
| 26661.4319 | 2580.43 |
| 26671.672 | 2586.91 |
| 26681.9121 | 2591.73 |
| 26692.1522 | 2595.13 |
| 26702.3923 | 2597.4 |
| 26712.6324 | 2598.78 |
| 26722.8725 | 2599.49 |
| 26733.1126 | 2599.62 |
| 26743.3527 | 2599.19 |
| 26753.5928 | 2598.23 |
| 26763.8329 | 2596.78 |
| 26774.073 | 2594.86 |
| 26784.3131 | 2592.51 |
| 26794.5532 | 2589.75 |
| 26804.7933 | 2586.63 |
| 26815.0334 | 2583.18 |
| 26825.2735 | 2579.42 |
| 26835.5136 | 2575.38 |
| 26845.7537 | 2571.11 |
| 26855.9938 | 2566.62 |
| 26866.2339 | 2561.95 |
| 26876.474 | 2557.14 |
| 26886.7141 | 2552.22 |
| 26896.9542 | 2547.21 |
| 26907.1943 | 2542.15 |
| 26917.4344 | 2537.07 |
| 26927.6745 | 2532.01 |
| 26937.9146 | 2526.99 |
| 26948.1547 | 2522.04 |
| 26958.3948 | 2517.21 |
| 26968.6349 | 2512.51 |
| 26978.875 | 2507.98 |
| 26989.1151 | 2503.66 |
| 26999.3552 | 2499.57 |
| 27009.5953 | 2495.75 |
| 27019.8353 | 2492.22 |
| 27030.0754 | 2489.03 |
| 27040.3155 | 2486.2 |
| 27050.5556 | 2483.76 |
| 27060.7957 | 2481.75 |
| 27071.0358 | 2480.19 |
| 27081.2759 | 2479.13 |
| 27091.516 | 2470.66 |
| 27101.7561 | 2461.9 |
| 27111.9962 | 2452.92 |
| 27122.2363 | 2443.8 |
| 27132.4764 | 2434.61 |
| 27142.7165 | 2425.42 |
| 27152.9566 | 2416.31 |
| 27163.1967 | 2407.34 |
| 27173.4368 | 2398.58 |
| 27183.6769 | 2390.04 |
| 27193.917 | 2381.73 |
| 27204.1571 | 2373.67 |
| 27214.3972 | 2365.84 |
| 27224.6373 | 2358.27 |
| 27234.8774 | 2350.95 |
| 27245.1175 | 2343.9 |
| 27255.3576 | 2337.12 |
| 27265.5977 | 2330.62 |
| 27275.8378 | 2324.4 |
| 27286.0779 | 2318.47 |
| 27296.318 | 2312.83 |
| 27306.5581 | 2307.5 |
| 27316.7982 | 2302.49 |
| 27327.0383 | 2297.78 |
| 27337.2784 | 2293.4 |
| 27347.5185 | 2289.35 |
| 27357.7586 | 2285.64 |
| 27367.9987 | 2282.27 |
| 27378.2388 | 2279.25 |
| 27388.4789 | 2276.57 |
| 27398.719 | 2274.19 |
| 27408.9591 | 2272.05 |
| 27419.1992 | 2270.08 |
| 27429.4393 | 2268.23 |
| 27439.6794 | 2266.43 |
| 27449.9195 | 2264.63 |
| 27460.1596 | 2262.77 |
| 27470.3997 | 2260.79 |
| 27480.6398 | 2258.62 |
| 27490.8799 | 2256.21 |
| 27501.12 | 2253.5 |
| 27511.3601 | 2250.42 |
| 27521.6002 | 2246.93 |
| 27531.8403 | 2242.95 |
| 27542.0804 | 2238.43 |
| 27552.3205 | 2233.33 |
| 27562.5606 | 2227.7 |
| 27572.8007 | 2221.61 |
| 27583.0408 | 2215.15 |
| 27593.2809 | 2208.37 |
| 27603.521 | 2201.36 |
| 27613.7611 | 2194.2 |
| 27624.0012 | 2186.94 |
| 27634.2413 | 2179.67 |
| 27644.4814 | 2172.46 |
| 27654.7215 | 2165.39 |
| 27664.9616 | 2158.52 |
| 27675.2017 | 2151.93 |
| 27685.4418 | 2145.7 |
| 27695.6819 | 2139.89 |
| 27705.922 | 2134.57 |
| 27716.1621 | 2129.73 |
| 27726.4022 | 2125.35 |
| 27736.6423 | 2121.4 |
| 27746.8824 | 2117.87 |
| 27757.1225 | 2114.73 |
| 27767.3626 | 2111.96 |
| 27777.6027 | 2109.54 |
| 27787.8428 | 2107.44 |
| 27798.0829 | 2105.65 |
| 27808.323 | 2104.14 |
| 27818.5631 | 2102.9 |
| 27828.8032 | 2101.89 |
| 27839.0433 | 2101.1 |
| 27849.2834 | 2100.5 |
| 27859.5235 | 2100.08 |
| 27869.7636 | 2099.81 |
| 27880.0037 | 2099.68 |
| 27890.2437 | 2099.64 |
| 27900.4838 | 2099.7 |
| 27910.7239 | 2099.82 |
| 27920.964 | 2099.98 |
| 27931.2041 | 2100.17 |
| 27941.4442 | 2100.35 |
| 27951.6843 | 2100.51 |
| 27961.9244 | 2100.62 |
| 27972.1645 | 2100.67 |
| 27982.4046 | 2100.63 |
| 27992.6447 | 2100.48 |
| 28002.8848 | 2100.21 |
| 28013.1249 | 2099.88 |
| 28023.365 | 2099.54 |
| 28033.6051 | 2099.28 |
| 28043.8452 | 2099.15 |
| 28054.0853 | 2099.21 |
| 28064.3254 | 2099.54 |
| 28074.5655 | 2100.21 |
| 28084.8056 | 2101.27 |
| 28095.0457 | 2102.8 |
| 28105.2858 | 2104.86 |
| 28115.5259 | 2107.52 |
| 28125.766 | 2110.83 |
| 28136.0061 | 2114.78 |
| 28146.2462 | 2119.36 |
| 28156.4863 | 2124.55 |
| 28166.7264 | 2130.34 |
| 28176.9665 | 2136.7 |
| 28187.2066 | 2143.61 |
| 28197.4467 | 2151.07 |
| 28207.6868 | 2159.05 |
| 28217.9269 | 2167.53 |
| 28228.167 | 2176.49 |
| 28238.4071 | 2185.91 |
| 28248.6472 | 2195.66 |
| 28258.8873 | 2205.64 |
| 28269.1274 | 2215.71 |
| 28279.3675 | 2225.74 |
| 28289.6076 | 2235.61 |
| 28299.8477 | 2241.78 |
| 28310.0878 | 2250.25 |
| 28320.3279 | 2260.56 |
| 28330.568 | 2272.25 |
| 28340.8081 | 2284.88 |
| 28351.0482 | 2297.98 |
| 28361.2883 | 2311.09 |
| 28371.5284 | 2323.77 |
| 28381.7685 | 2335.55 |
| 28392.0086 | 2346.06 |
| 28402.2487 | 2355.24 |
| 28412.4888 | 2363.12 |
| 28422.7289 | 2369.72 |
| 28432.969 | 2375.06 |
| 28443.2091 | 2379.16 |
| 28453.4492 | 2382.06 |
| 28463.6893 | 2383.77 |
| 28473.9294 | 2384.32 |
| 28484.1695 | 2383.73 |
| 28494.4096 | 2382.02 |
| 28504.6497 | 2379.22 |
| 28514.8898 | 2375.35 |
| 28525.1299 | 2370.44 |
| 28535.37 | 2364.51 |
| 28545.6101 | 2357.58 |
| 28555.8502 | 2349.68 |
| 28566.0903 | 2340.83 |
| 28576.3304 | 2331.05 |
| 28586.5705 | 2320.37 |
| 28596.8106 | 2308.81 |
| 28607.0507 | 2296.43 |
| 28617.2908 | 2283.48 |
| 28627.5309 | 2270.22 |
| 28637.771 | 2256.94 |
| 28648.0111 | 2243.9 |
| 28658.2512 | 2231.39 |
| 28668.4913 | 2219.63 |
| 28678.7314 | 2208.69 |
| 28688.9715 | 2198.58 |
| 28699.2116 | 2189.31 |
| 28709.4517 | 2180.9 |
| 28719.6918 | 2173.38 |
| 28729.9319 | 2166.74 |
| 28740.172 | 2161.01 |
| 28750.4121 | 2156.18 |
| 28760.6522 | 2152.21 |
| 28770.8923 | 2149 |
| 28781.1324 | 2146.49 |
| 28791.3725 | 2144.59 |
| 28801.6125 | 2143.23 |
| 28811.8526 | 2142.34 |
| 28822.0927 | 2141.84 |
| 28832.3328 | 2141.65 |
| 28842.5729 | 2141.69 |
| 28852.813 | 2141.9 |
| 28863.0531 | 2142.19 |
| 28873.2932 | 2142.48 |
| 28883.5333 | 2142.71 |
| 28893.7734 | 2142.8 |
| 28904.0135 | 2142.76 |
| 28914.2536 | 2142.61 |
| 28924.4937 | 2142.34 |
| 28934.7338 | 2141.97 |
| 28944.9739 | 2141.52 |
| 28955.214 | 2141 |
| 28965.4541 | 2140.42 |
| 28975.6942 | 2139.79 |
| 28985.9343 | 2139.13 |
| 28996.1744 | 2138.44 |
| 29006.4145 | 2137.74 |
| 29016.6546 | 2137.04 |
| 29026.8947 | 2136.36 |
| 29037.1348 | 2135.7 |
| 29047.3749 | 2135.09 |
| 29057.615 | 2134.52 |
| 29067.8551 | 2134.01 |
| 29078.0952 | 2133.58 |
| 29088.3353 | 2133.24 |
| 29098.5754 | 2132.99 |
| 29108.8155 | 2132.86 |
| 29119.0556 | 2132.86 |
| 29129.2957 | 2132.98 |
| 29139.5358 | 2133.24 |
| 29149.7759 | 2133.61 |
| 29160.016 | 2134.11 |
| 29170.2561 | 2134.71 |
| 29180.4962 | 2135.42 |
| 29190.7363 | 2136.22 |
| 29200.9764 | 2137.12 |
| 29211.2165 | 2138.1 |
| 29221.4566 | 2139.15 |
| 29231.6967 | 2140.27 |
| 29241.9368 | 2141.46 |
| 29252.1769 | 2142.71 |
| 29262.417 | 2144.03 |
| 29272.6571 | 2145.51 |
| 29282.8972 | 2147.29 |
| 29293.1373 | 2149.48 |
| 29303.3774 | 2152.2 |
| 29313.6175 | 2155.57 |
| 29323.8576 | 2159.71 |
| 29334.0977 | 2164.75 |
| 29344.3378 | 2170.79 |
| 29354.5779 | 2177.97 |
| 29364.818 | 2186.4 |
| 29375.0581 | 2196.2 |
| 29385.2982 | 2207.43 |
| 29395.5383 | 2219.87 |
| 29405.7784 | 2233.27 |
| 29416.0185 | 2247.34 |
| 29426.2586 | 2261.82 |
| 29436.4987 | 2276.43 |
| 29446.7388 | 2290.91 |
| 29456.9789 | 2305.01 |
| 29467.219 | 2318.48 |
| 29477.4591 | 2331.09 |
| 29487.6992 | 2342.59 |
| 29497.9393 | 2352.8 |
| 29508.1794 | 2361.73 |
| 29518.4195 | 2369.47 |
| 29528.6596 | 2376.08 |
| 29538.8997 | 2381.66 |
| 29549.1398 | 2386.27 |
| 29559.3799 | 2389.99 |
| 29569.62 | 2392.89 |
| 29579.8601 | 2395.06 |
| 29590.1002 | 2396.58 |
| 29600.3403 | 2397.5 |
| 29610.5804 | 2397.93 |
| 29620.8205 | 2397.92 |
| 29631.0606 | 2397.56 |
| 29641.3007 | 2396.92 |
| 29651.5408 | 2396.08 |
| 29661.7809 | 2395.11 |
| 29672.021 | 2394.03 |
| 29682.2611 | 2392.85 |
| 29692.5012 | 2391.6 |
| 29702.7413 | 2390.27 |
| 29712.9814 | 2388.9 |
| 29723.2215 | 2387.49 |
| 29733.4616 | 2386.06 |
| 29743.7017 | 2384.62 |
| 29753.9418 | 2383.18 |
| 29764.1819 | 2381.76 |
| 29774.422 | 2380.38 |
| 29784.662 | 2379.05 |
| 29794.9021 | 2377.78 |
| 29805.1422 | 2376.59 |
| 29815.3823 | 2375.49 |
| 29825.6224 | 2374.5 |
| 29835.8625 | 2373.62 |
| 29846.1026 | 2372.88 |
| 29856.3427 | 2372.3 |
| 29866.5828 | 2371.87 |
| 29876.8229 | 2371.62 |
| 29887.063 | 2371.57 |
| 29897.3031 | 2371.72 |
| 29907.5432 | 2372.1 |
| 29917.7833 | 2372.7 |
| 29928.0234 | 2373.56 |
| 29938.2635 | 2374.69 |
| 29948.5036 | 2376.09 |
| 29958.7437 | 2377.78 |
| 29968.9838 | 2373.71 |
| 29979.2239 | 2370.01 |
| 29989.464 | 2366.64 |
| 29999.7041 | 2363.61 |
| 30009.9442 | 2360.9 |
| 30020.1843 | 2358.49 |
| 30030.4244 | 2356.38 |
| 30040.6645 | 2354.53 |
| 30050.9046 | 2352.96 |
| 30061.1447 | 2351.63 |
| 30071.3848 | 2350.53 |
| 30081.6249 | 2349.66 |
| 30091.865 | 2348.99 |
| 30102.1051 | 2348.51 |
| 30112.3452 | 2348.22 |
| 30122.5853 | 2348.09 |
| 30132.8254 | 2348.12 |
| 30143.0655 | 2348.28 |
| 30153.3056 | 2348.56 |
| 30163.5457 | 2348.96 |
| 30173.7858 | 2349.45 |
| 30184.0259 | 2350.03 |
| 30194.266 | 2350.68 |
| 30204.5061 | 2351.38 |
| 30214.7462 | 2352.12 |
| 30224.9863 | 2352.89 |
| 30235.2264 | 2353.67 |
| 30245.4665 | 2354.45 |
| 30255.7066 | 2355.22 |
| 30265.9467 | 2355.97 |
| 30276.1868 | 2356.67 |
| 30286.4269 | 2357.31 |
| 30296.667 | 2357.89 |
| 30306.9071 | 2358.38 |
| 30317.1472 | 2358.78 |
| 30327.3873 | 2359.06 |
| 30337.6274 | 2359.23 |
| 30347.8675 | 2359.25 |
| 30358.1076 | 2359.13 |
| 30368.3477 | 2358.84 |
| 30378.5878 | 2358.37 |
| 30388.8279 | 2357.7 |
| 30399.068 | 2356.84 |
| 30409.3081 | 2355.75 |
| 30419.5482 | 2354.43 |
| 30429.7883 | 2352.86 |
| 30440.0284 | 2351.04 |
| 30450.2685 | 2348.93 |
| 30460.5086 | 2346.48 |
| 30470.7487 | 2343.64 |
| 30480.9888 | 2340.35 |
| 30491.2289 | 2336.55 |
| 30501.469 | 2332.17 |
| 30511.7091 | 2327.16 |
| 30521.9492 | 2321.45 |
| 30532.1893 | 2315 |
| 30542.4294 | 2307.73 |
| 30552.6695 | 2299.58 |
| 30562.9096 | 2290.51 |
| 30573.1497 | 2280.49 |
| 30583.3898 | 2269.74 |
| 30593.6299 | 2258.49 |
| 30603.87 | 2247.01 |
| 30614.1101 | 2235.55 |
| 30624.3502 | 2224.35 |
| 30634.5903 | 2213.64 |
| 30644.8304 | 2203.5 |
| 30655.0705 | 2194.01 |
| 30665.3106 | 2185.22 |
| 30675.5507 | 2177.19 |
| 30685.7908 | 2169.97 |
| 30696.0309 | 2163.64 |
| 30706.271 | 2158.26 |
| 30716.5111 | 2153.87 |
| 30726.7512 | 2150.55 |
| 30736.9913 | 2148.35 |
| 30747.2314 | 2147.34 |
| 30757.4715 | 2147.58 |
| 30767.7116 | 2149.11 |
| 30777.9517 | 2152.02 |
| 30788.1918 | 2156.35 |
| 30798.4319 | 2162.17 |
| 30808.672 | 2169.54 |
| 30818.9121 | 2178.51 |
| 30829.1522 | 2189.16 |
| 30839.3922 | 2201.18 |
| 30849.6323 | 2212.89 |
| 30859.8724 | 2222.23 |
| 30870.1125 | 2227.17 |
| 30880.3526 | 2226.13 |
| 30890.5927 | 2219.54 |
| 30900.8328 | 2208.3 |
| 30911.0729 | 2193.31 |
| 30921.313 | 2175.47 |
| 30931.5531 | 2155.69 |
| 30941.7932 | 2134.86 |
| 30952.0333 | 2113.89 |
| 30962.2734 | 2093.69 |
| 30972.5135 | 2075.14 |
| 30982.7536 | 2058.96 |
| 30992.9937 | 2045.05 |
| 31003.2338 | 2033.09 |
| 31013.4739 | 2022.79 |
| 31023.714 | 2013.84 |
| 31033.9541 | 2005.95 |
| 31044.1942 | 1998.8 |
| 31054.4343 | 1992.09 |
| 31064.6744 | 1985.6 |
| 31074.9145 | 1979.34 |
| 31085.1546 | 1973.42 |
| 31095.3947 | 1967.95 |
| 31105.6348 | 1963.01 |
| 31115.8749 | 1958.71 |
| 31126.115 | 1955.14 |
| 31136.3551 | 1952.41 |
| 31146.5952 | 1950.62 |
| 31156.8353 | 1949.87 |
| 31167.0754 | 1950.22 |
| 31177.3155 | 1951.7 |
| 31187.5556 | 1954.27 |
| 31197.7957 | 1957.93 |
| 31208.0358 | 1962.65 |
| 31218.2759 | 1968.41 |
| 31228.516 | 1975.2 |
| 31238.7561 | 1982.96 |
| 31248.9962 | 1991.46 |
| 31259.2363 | 2000.44 |
| 31269.4764 | 2009.62 |
| 31279.7165 | 2018.75 |
| 31289.9566 | 2027.54 |
| 31300.1967 | 2035.73 |
| 31310.4368 | 2043.17 |
| 31320.6769 | 2050.17 |
| 31330.917 | 2057.13 |
| 31341.1571 | 2064.48 |
| 31351.3972 | 2072.64 |
| 31361.6373 | 2082.01 |
| 31371.8774 | 2093.03 |
| 31382.1175 | 2106.11 |
| 31392.3576 | 2121.37 |
| 31402.5977 | 2137.79 |
| 31412.8378 | 2154.03 |
| 31423.0779 | 2168.78 |
| 31433.318 | 2180.71 |
| 31443.5581 | 2188.81 |
| 31453.7982 | 2193.31 |
| 31464.0383 | 2194.73 |
| 31474.2784 | 2193.61 |
| 31484.5185 | 2190.48 |
| 31494.7586 | 2185.89 |
| 31504.9987 | 2180.37 |
| 31515.2388 | 2174.44 |
| 31525.4789 | 2168.65 |
| 31535.719 | 2163.52 |
| 31545.9591 | 2159.6 |
| 31556.1992 | 2157.29 |
| 31566.4393 | 2156.53 |
| 31576.6794 | 2157.1 |
| 31586.9195 | 2158.82 |
| 31597.1596 | 2161.49 |
| 31607.3997 | 2164.91 |
| 31617.6398 | 2168.88 |
| 31627.8799 | 2173.21 |
| 31638.12 | 2177.69 |
| 31648.3601 | 2182.14 |
| 31658.6002 | 2186.34 |
| 31668.8403 | 2190.14 |
| 31679.0804 | 2193.47 |
| 31689.3205 | 2196.29 |
| 31699.5606 | 2198.57 |
| 31709.8007 | 2200.26 |
| 31720.0408 | 2201.34 |
| 31730.2809 | 2201.77 |
| 31740.521 | 2201.5 |
| 31750.7611 | 2200.51 |
| 31761.0012 | 2198.75 |
| 31771.2413 | 2196.2 |
| 31781.4814 | 2192.84 |
| 31791.7215 | 2188.81 |
| 31801.9616 | 2184.27 |
| 31812.2017 | 2179.38 |
| 31822.4418 | 2174.3 |
| 31832.6819 | 2169.21 |
| 31842.922 | 2164.25 |
| 31853.1621 | 2159.6 |
| 31863.4022 | 2155.4 |
| 31873.6423 | 2151.69 |
| 31883.8824 | 2148.53 |
| 31894.1225 | 2145.94 |
| 31904.3626 | 2143.96 |
| 31914.6027 | 2142.63 |
| 31924.8428 | 2141.98 |
| 31935.0829 | 2142.05 |
| 31945.323 | 2142.88 |
| 31955.5631 | 2144.49 |
| 31965.8032 | 2146.93 |
| 31976.0433 | 2150.19 |
| 31986.2833 | 2154.06 |
| 31996.5234 | 2158.31 |
| 32006.7635 | 2162.7 |
| 32017.0036 | 2166.99 |
| 32027.2437 | 2170.92 |
| 32037.4838 | 2174.27 |
| 32047.7239 | 2176.78 |
| 32057.964 | 2178.22 |
| 32068.2041 | 2178.34 |
| 32078.4442 | 2176.91 |
| 32088.6843 | 2173.68 |
| 32098.9244 | 2168.5 |
| 32109.1645 | 2161.64 |
| 32119.4046 | 2153.44 |
| 32129.6447 | 2144.27 |
| 32139.8848 | 2134.47 |
| 32150.1249 | 2124.41 |
| 32160.365 | 2114.39 |
| 32170.6051 | 2104.58 |
| 32180.8452 | 2095.1 |
| 32191.0853 | 2086.07 |
| 32201.3254 | 2077.61 |
| 32211.5655 | 2069.84 |
| 32221.8056 | 2062.87 |
| 32232.0457 | 2056.84 |
| 32242.2858 | 2051.87 |
| 32252.5259 | 2048.06 |
| 32262.766 | 2045.55 |
| 32273.0061 | 2044.46 |
| 32283.2462 | 2044.9 |
| 32293.4863 | 2046.99 |
| 32303.298 | -9999 |